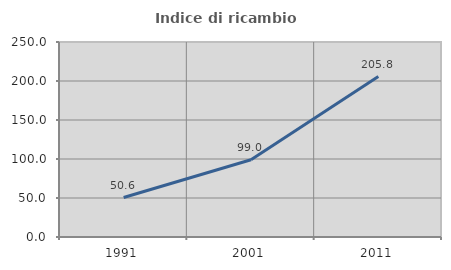
| Category | Indice di ricambio occupazionale  |
|---|---|
| 1991.0 | 50.599 |
| 2001.0 | 99.013 |
| 2011.0 | 205.761 |